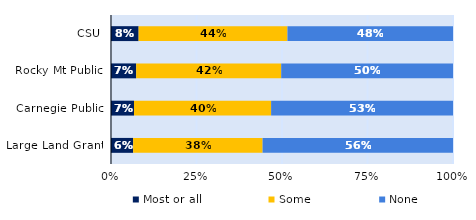
| Category | Most or all | Some | None |
|---|---|---|---|
| CSU | 0.081 | 0.435 | 0.484 |
| Rocky Mt Public | 0.074 | 0.424 | 0.502 |
| Carnegie Public | 0.067 | 0.401 | 0.532 |
| Large Land Grant | 0.065 | 0.378 | 0.557 |